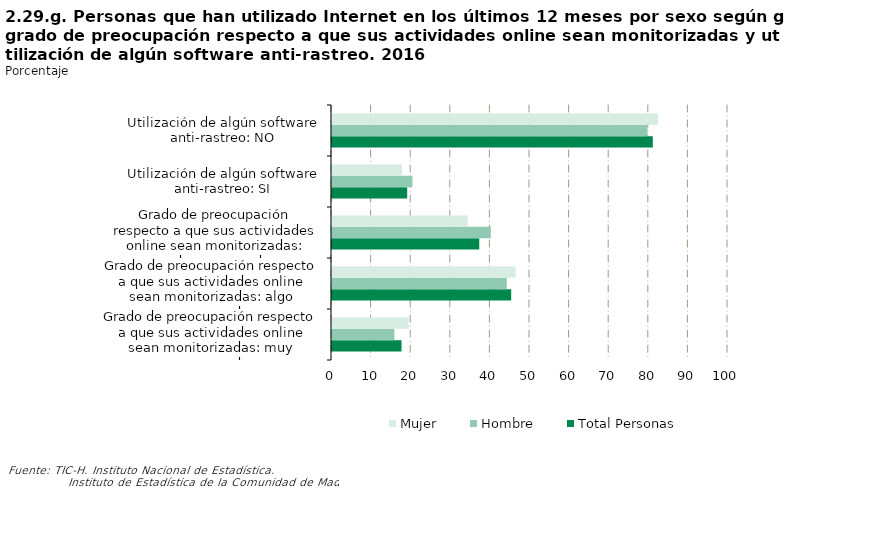
| Category | Total Personas | Hombre | Mujer |
|---|---|---|---|
| Grado de preocupación respecto a que sus actividades online sean monitorizadas: muy preocupado | 17.56 | 15.757 | 19.359 |
| Grado de preocupación respecto a que sus actividades online sean monitorizadas: algo preocupado | 45.251 | 44.138 | 46.361 |
| Grado de preocupación respecto a que sus actividades online sean monitorizadas: nada preocupado | 37.189 | 40.105 | 34.279 |
| Utilización de algún software anti-rastreo: SI | 18.991 | 20.324 | 17.66 |
| Utilización de algún software anti-rastreo: NO | 81.009 | 79.676 | 82.34 |